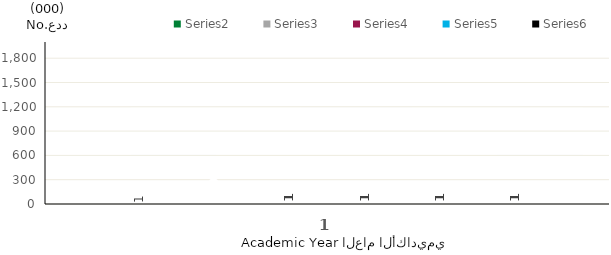
| Category | Series 0 | Series 1 | Series 2 | Series 3 | Series 4 | Series 5 |
|---|---|---|---|---|---|---|
| 0 | 1 | 1 | 1 | 1 | 1 | 1 |